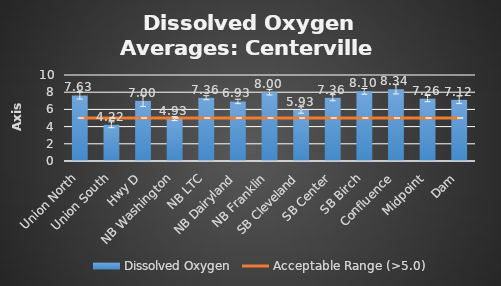
| Category | Dissolved Oxygen |
|---|---|
| Union North | 7.63 |
| Union South | 4.218 |
| Hwy D | 6.998 |
| NB Washington | 4.931 |
| NB LTC | 7.36 |
| NB Dairyland | 6.925 |
| NB Franklin | 8 |
| SB Cleveland | 5.933 |
| SB Center | 7.356 |
| SB Birch | 8.1 |
| Confluence | 8.341 |
| Midpoint | 7.263 |
| Dam | 7.121 |